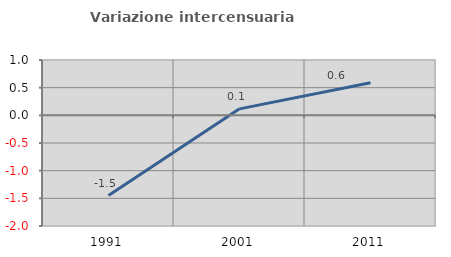
| Category | Variazione intercensuaria annua |
|---|---|
| 1991.0 | -1.45 |
| 2001.0 | 0.117 |
| 2011.0 | 0.587 |